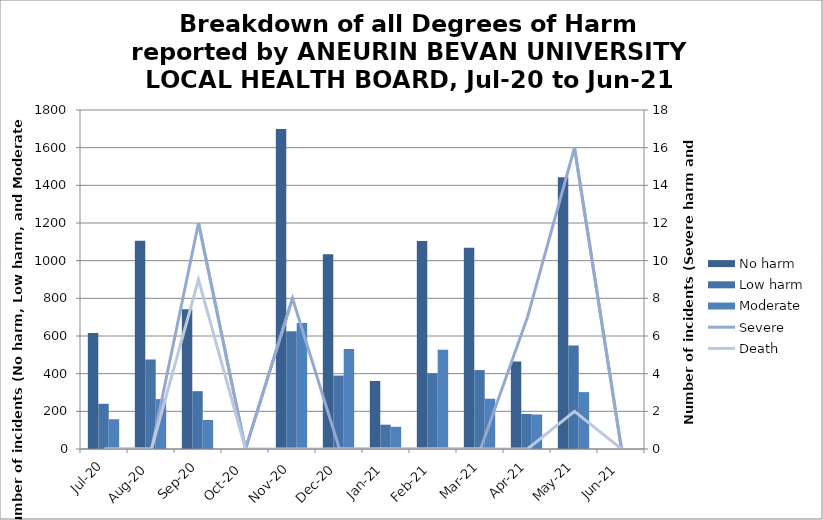
| Category | No harm | Low harm | Moderate |
|---|---|---|---|
| Jul-20 | 616 | 240 | 158 |
| Aug-20 | 1106 | 475 | 265 |
| Sep-20 | 742 | 307 | 154 |
| Oct-20 | 0 | 0 | 0 |
| Nov-20 | 1699 | 625 | 669 |
| Dec-20 | 1034 | 390 | 531 |
| Jan-21 | 361 | 129 | 118 |
| Feb-21 | 1104 | 402 | 527 |
| Mar-21 | 1069 | 419 | 267 |
| Apr-21 | 464 | 186 | 183 |
| May-21 | 1443 | 549 | 302 |
| Jun-21 | 0 | 0 | 0 |